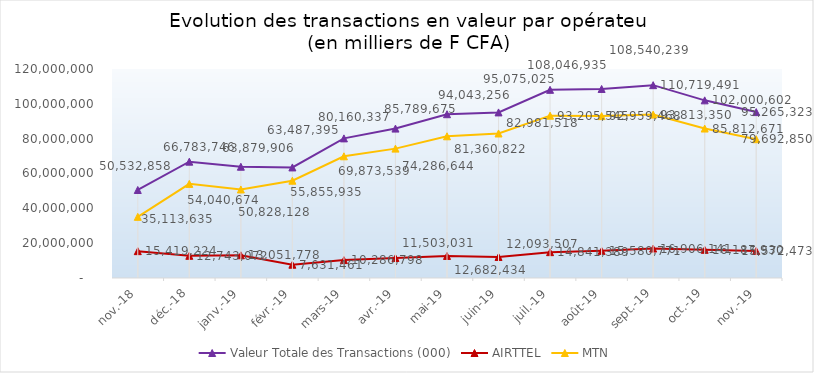
| Category | Valeur Totale des Transactions (000) | AIRTTEL | MTN |
|---|---|---|---|
| 2018-11-01 | 50532858.364 | 15419223.723 | 35113634.641 |
| 2018-12-01 | 66783745.765 | 12743071.938 | 54040673.827 |
| 2019-01-01 | 63879906.229 | 13051778.479 | 50828127.75 |
| 2019-02-01 | 63487395.452 | 7631460.71 | 55855934.742 |
| 2019-03-01 | 80160336.912 | 10286797.824 | 69873539.088 |
| 2019-04-01 | 85789674.788 | 11503030.616 | 74286644.172 |
| 2019-05-01 | 94043256 | 12682433.828 | 81360822.172 |
| 2019-06-01 | 95075024.999 | 12093507.069 | 82981517.93 |
| 2019-07-01 | 108046934.535 | 14841389.063 | 93205545.472 |
| 2019-08-01 | 108540239.004 | 15580770.638 | 92959468.366 |
| 2019-09-01 | 110719490.905 | 16906141.33 | 93813349.575 |
| 2019-10-01 | 102000601.66 | 16187930.274 | 85812671.386 |
| 2019-11-01 | 95265323.49 | 15572473 | 79692850.49 |